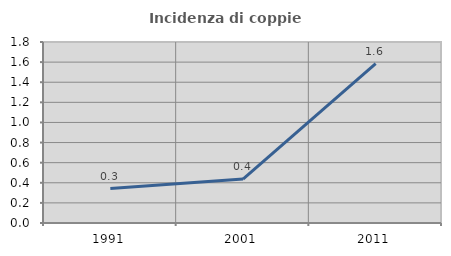
| Category | Incidenza di coppie miste |
|---|---|
| 1991.0 | 0.343 |
| 2001.0 | 0.437 |
| 2011.0 | 1.585 |